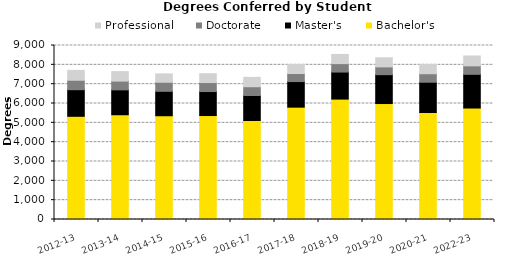
| Category | Bachelor's | Master's | Doctorate | Professional |
|---|---|---|---|---|
| 2012-13 | 5338 | 1375 | 490 | 510 |
| 2013-14 | 5419 | 1287 | 453 | 490 |
| 2014-15 | 5367 | 1264 | 468 | 434 |
| 2015-16 | 5377 | 1242 | 464 | 458 |
| 2016-17 | 5121 | 1294 | 452 | 484 |
| 2017-18 | 5811 | 1324 | 418 | 467 |
| 2018-19 | 6228 | 1398 | 436 | 477 |
| 2019-20 | 5998 | 1494 | 402 | 472 |
| 2020-21 | 5533 | 1567 | 440 | 480 |
| 2022-23 | 5766 | 1743 | 438 | 511 |